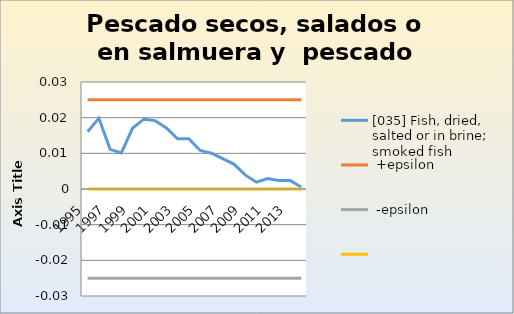
| Category | [035] Fish, dried, salted or in brine; smoked fish |  +epsilon |  -epsilon | Series 3 |
|---|---|---|---|---|
| 1995.0 | 0.016 | 0.025 | -0.025 |  |
| 1996.0 | 0.02 | 0.025 | -0.025 |  |
| 1997.0 | 0.011 | 0.025 | -0.025 |  |
| 1998.0 | 0.01 | 0.025 | -0.025 |  |
| 1999.0 | 0.017 | 0.025 | -0.025 |  |
| 2000.0 | 0.02 | 0.025 | -0.025 |  |
| 2001.0 | 0.019 | 0.025 | -0.025 |  |
| 2002.0 | 0.017 | 0.025 | -0.025 |  |
| 2003.0 | 0.014 | 0.025 | -0.025 |  |
| 2004.0 | 0.014 | 0.025 | -0.025 |  |
| 2005.0 | 0.011 | 0.025 | -0.025 |  |
| 2006.0 | 0.01 | 0.025 | -0.025 |  |
| 2007.0 | 0.009 | 0.025 | -0.025 |  |
| 2008.0 | 0.007 | 0.025 | -0.025 |  |
| 2009.0 | 0.004 | 0.025 | -0.025 |  |
| 2010.0 | 0.002 | 0.025 | -0.025 |  |
| 2011.0 | 0.003 | 0.025 | -0.025 |  |
| 2012.0 | 0.002 | 0.025 | -0.025 |  |
| 2013.0 | 0.002 | 0.025 | -0.025 |  |
| 2014.0 | 0 | 0.025 | -0.025 |  |